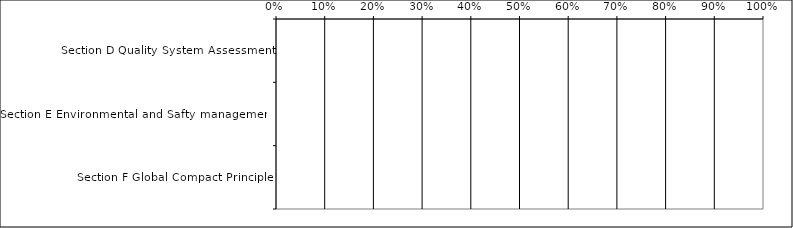
| Category | Actual output in % / Erreichte % |
|---|---|
| Section D Quality System Assessment | 0 |
| Section E Environmental and Safty management  | 0 |
| Section F Global Compact Principle | 0 |